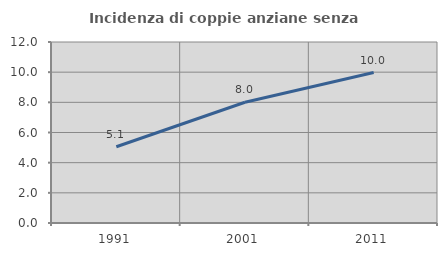
| Category | Incidenza di coppie anziane senza figli  |
|---|---|
| 1991.0 | 5.055 |
| 2001.0 | 8.005 |
| 2011.0 | 9.973 |